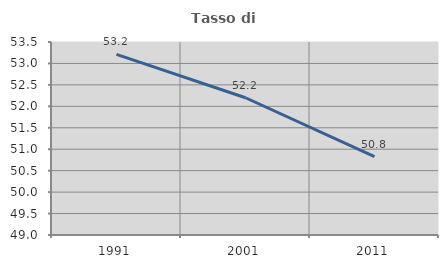
| Category | Tasso di occupazione   |
|---|---|
| 1991.0 | 53.211 |
| 2001.0 | 52.2 |
| 2011.0 | 50.83 |